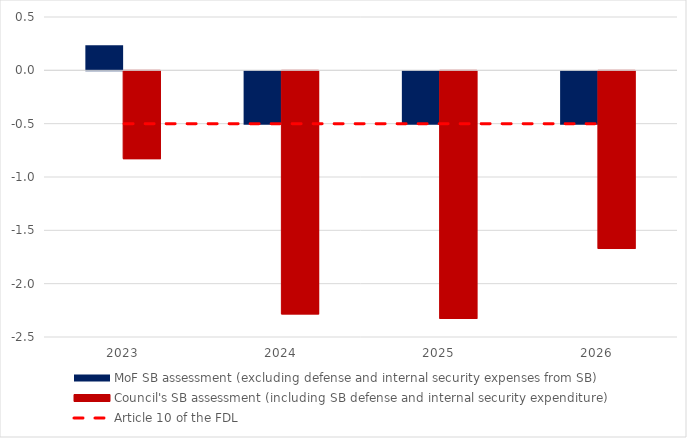
| Category | MoF SB assessment (excluding defense and internal security expenses from SB) | Council's SB assessment (including SB defense and internal security expenditure) |
|---|---|---|
| 2023.0 | 0.235 | -0.823 |
| 2024.0 | -0.5 | -2.279 |
| 2025.0 | -0.5 | -2.322 |
| 2026.0 | -0.5 | -1.666 |